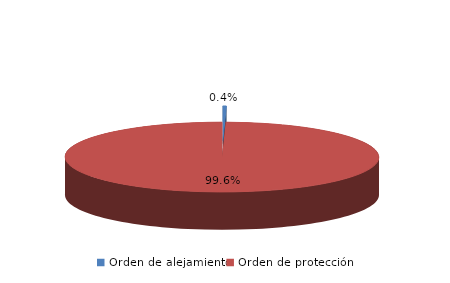
| Category | Series 0 |
|---|---|
| Orden de alejamiento | 3 |
| Orden de protección | 813 |